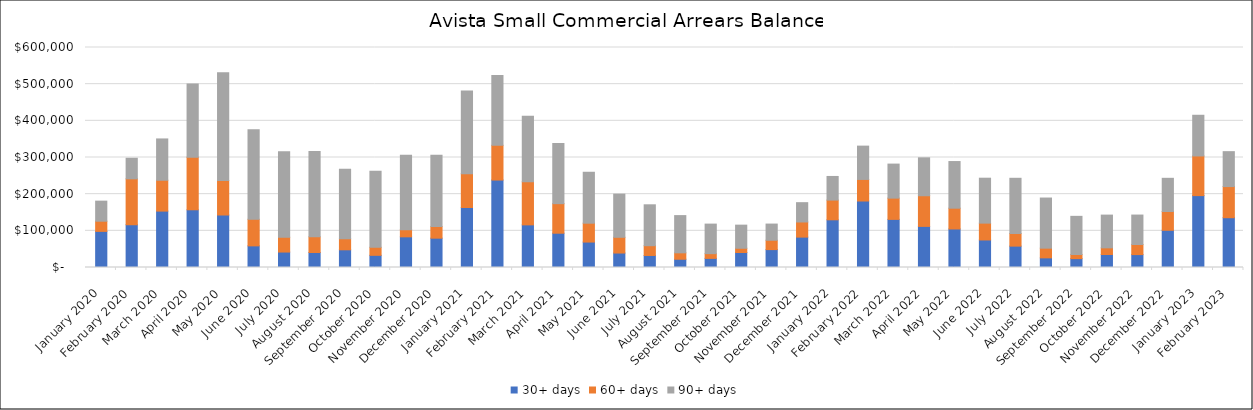
| Category | 30+ days | 60+ days | 90+ days |
|---|---|---|---|
| 2020-01-01 | 98475.48 | 27798.27 | 54693.55 |
| 2020-02-01 | 116608.96 | 125236.6 | 56067.98 |
| 2020-03-01 | 153804.89 | 84150.87 | 112687.33 |
| 2020-04-01 | 157395.4 | 143439.09 | 199951.95 |
| 2020-05-01 | 143159.03 | 93887.76 | 293943.98 |
| 2020-06-01 | 58992.04 | 72469.28 | 244068.54 |
| 2020-07-01 | 42134.13 | 40317.34 | 233517.65 |
| 2020-08-01 | 40917.78 | 42681.3 | 232497.1 |
| 2020-09-01 | 48230.27 | 29865.03 | 190186.93 |
| 2020-10-01 | 33198.29 | 21902.26 | 207584.66 |
| 2020-11-01 | 83632.49 | 19621.26 | 202733.72 |
| 2020-12-01 | 79996.51 | 31520.56 | 194763.93 |
| 2021-01-01 | 163674.81 | 92193.9 | 225374.37 |
| 2021-02-01 | 238476.44 | 94702.74 | 190494.37 |
| 2021-03-01 | 116260.48 | 117333.49 | 179040.65 |
| 2021-04-01 | 93514.2 | 80586.89 | 164074.1 |
| 2021-05-01 | 69360.23 | 51482.19 | 138898.18 |
| 2021-06-01 | 39447.07 | 42945.4 | 117691.29 |
| 2021-07-01 | 32809.23 | 26664.54 | 111516.34 |
| 2021-08-01 | 22517.47 | 17526.41 | 101485.53 |
| 2021-09-01 | 24876.12 | 12899.82 | 80573.67 |
| 2021-10-01 | 40831.8 | 11628.96 | 63039.08 |
| 2021-11-01 | 48844.7 | 25489.11 | 44116.9 |
| 2021-12-01 | 82882.55 | 41270.7 | 52668.29 |
| 2022-01-01 | 130066.29 | 53777.29 | 64453.94 |
| 2022-02-01 | 181323.72 | 58848.27 | 90856.38 |
| 2022-03-01 | 131210.48 | 57987.59 | 92821.93 |
| 2022-04-01 | 112115.14 | 83575.49 | 103427.99 |
| 2022-05-01 | 105085.92 | 56672.24 | 127208.47 |
| 2022-06-01 | 75048.91 | 45953.9 | 122536.24 |
| 2022-07-01 | 58289.32 | 34463.36 | 150532.41 |
| 2022-08-01 | 26307.82 | 26458.62 | 136679.9 |
| 2022-09-01 | 24194.69 | 11218.1 | 104085.69 |
| 2022-10-01 | 35489.66 | 18130.28 | 89291.14 |
| 2022-11-01 | 35202.93 | 27598.28 | 80229.19 |
| 2022-12-01 | 101495.63 | 51225.76 | 90520.19 |
| 2023-01-01 | 196058.74 | 108148.34 | 110957.48 |
| 2023-02-01 | 135770.28 | 84959.09 | 95203.16 |